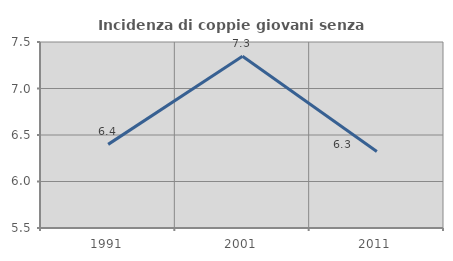
| Category | Incidenza di coppie giovani senza figli |
|---|---|
| 1991.0 | 6.399 |
| 2001.0 | 7.347 |
| 2011.0 | 6.322 |